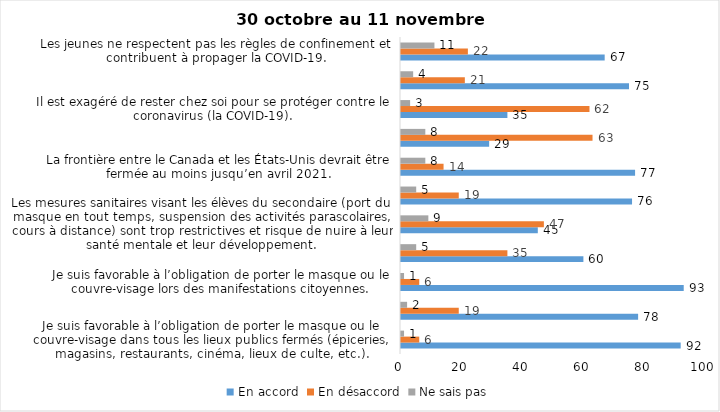
| Category | En accord | En désaccord | Ne sais pas |
|---|---|---|---|
| Je suis favorable à l’obligation de porter le masque ou le couvre-visage dans tous les lieux publics fermés (épiceries, magasins, restaurants, cinéma, lieux de culte, etc.). | 92 | 6 | 1 |
| C’est une bonne chose que les policiers puissent donner facilement des contraventions aux gens qui ne respectent pas les mesures pour prévenir le coronavirus (la COVID-19). | 78 | 19 | 2 |
| Je suis favorable à l’obligation de porter le masque ou le couvre-visage lors des manifestations citoyennes. | 93 | 6 | 1 |
| C’est une bonne chose d’arrêter les activités sportives de groupe (ex. hockey, soccer, yoga, etc.) et de fermer les centres d’entraînement (gyms) dans les zones rouges. | 60 | 35 | 5 |
| Les mesures sanitaires visant les élèves du secondaire (port du masque en tout temps, suspension des activités parascolaires, cours à distance) sont trop restrictives et risque de nuire à leur santé mentale et leur développement. | 45 | 47 | 9 |
| Je suis favorable à l’obligation de porter le masque ou le couvre-visage en tout temps pour les élèves au secondaire. | 76 | 19 | 5 |
| La frontière entre le Canada et les États-Unis devrait être fermée au moins jusqu’en avril 2021. | 77 | 14 | 8 |
| Le gouvernement et les médias exagèrent par rapport au coronavirus (la COVID-19). | 29 | 63 | 8 |
| Il est exagéré de rester chez soi pour se protéger contre le coronavirus (la COVID-19). | 35 | 62 | 3 |
| J’ai peur que le système de santé soit débordé par les cas de COVID-19 suite au «déconfinement». | 75 | 21 | 4 |
| Les jeunes ne respectent pas les règles de confinement et contribuent à propager la COVID-19. | 67 | 22 | 11 |